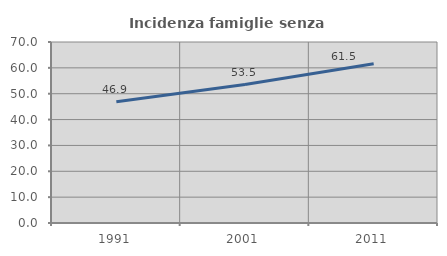
| Category | Incidenza famiglie senza nuclei |
|---|---|
| 1991.0 | 46.871 |
| 2001.0 | 53.538 |
| 2011.0 | 61.549 |